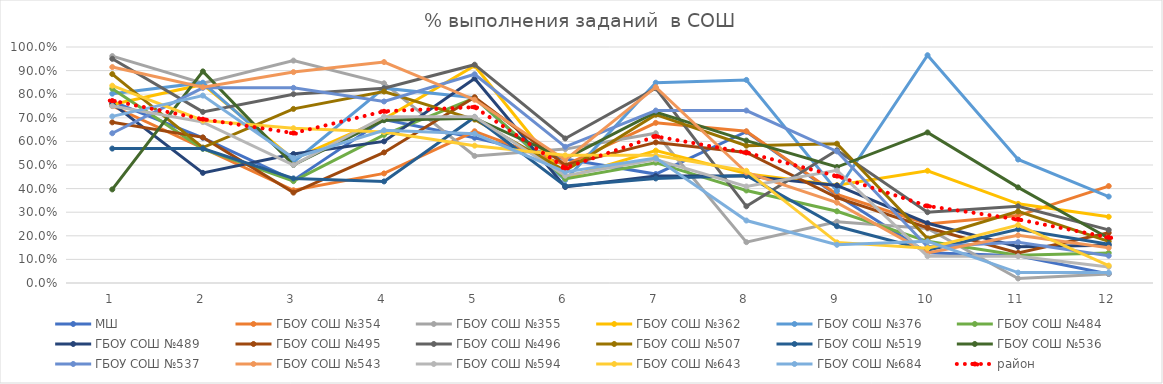
| Category | МШ | ГБОУ СОШ №354 | ГБОУ СОШ №355 | ГБОУ СОШ №362 | ГБОУ СОШ №376 | ГБОУ СОШ №484 | ГБОУ СОШ №489 | ГБОУ СОШ №495 | ГБОУ СОШ №496 | ГБОУ СОШ №507 | ГБОУ СОШ №519 | ГБОУ СОШ №536 | ГБОУ СОШ №537 | ГБОУ СОШ №543 | ГБОУ СОШ №594 | ГБОУ СОШ №643 | ГБОУ СОШ №684 | район |
|---|---|---|---|---|---|---|---|---|---|---|---|---|---|---|---|---|---|---|
| 0 | 0.769 | 0.75 | 0.962 | 0.756 | 0.802 | 0.824 | 0.76 | 0.681 | 0.95 | 0.885 | 0.57 | 0.397 | 0.635 | 0.915 | 0.75 | 0.836 | 0.706 | 0.773 |
| 1 | 0.615 | 0.571 | 0.846 | 0.841 | 0.849 | 0.569 | 0.467 | 0.617 | 0.725 | 0.574 | 0.57 | 0.897 | 0.827 | 0.83 | 0.682 | 0.689 | 0.794 | 0.694 |
| 2 | 0.436 | 0.393 | 0.942 | 0.524 | 0.512 | 0.431 | 0.547 | 0.383 | 0.8 | 0.738 | 0.443 | 0.5 | 0.827 | 0.894 | 0.5 | 0.656 | 0.529 | 0.635 |
| 3 | 0.692 | 0.464 | 0.846 | 0.695 | 0.826 | 0.627 | 0.6 | 0.553 | 0.825 | 0.811 | 0.43 | 0.69 | 0.769 | 0.936 | 0.705 | 0.639 | 0.647 | 0.728 |
| 4 | 0.615 | 0.643 | 0.538 | 0.921 | 0.785 | 0.784 | 0.867 | 0.787 | 0.925 | 0.693 | 0.703 | 0.698 | 0.885 | 0.777 | 0.705 | 0.582 | 0.632 | 0.745 |
| 5 | 0.526 | 0.5 | 0.567 | 0.445 | 0.436 | 0.441 | 0.407 | 0.5 | 0.612 | 0.475 | 0.411 | 0.526 | 0.577 | 0.521 | 0.455 | 0.541 | 0.471 | 0.488 |
| 6 | 0.462 | 0.679 | 0.635 | 0.561 | 0.849 | 0.51 | 0.453 | 0.596 | 0.825 | 0.713 | 0.443 | 0.724 | 0.731 | 0.83 | 0.523 | 0.541 | 0.529 | 0.622 |
| 7 | 0.641 | 0.643 | 0.173 | 0.463 | 0.86 | 0.392 | 0.453 | 0.553 | 0.325 | 0.582 | 0.456 | 0.603 | 0.731 | 0.468 | 0.409 | 0.475 | 0.265 | 0.552 |
| 8 | 0.372 | 0.375 | 0.26 | 0.415 | 0.39 | 0.304 | 0.413 | 0.362 | 0.562 | 0.59 | 0.241 | 0.491 | 0.558 | 0.34 | 0.477 | 0.172 | 0.162 | 0.453 |
| 9 | 0.128 | 0.25 | 0.231 | 0.476 | 0.965 | 0.176 | 0.253 | 0.234 | 0.3 | 0.189 | 0.139 | 0.638 | 0.154 | 0.128 | 0.114 | 0.148 | 0.176 | 0.326 |
| 10 | 0.115 | 0.286 | 0.019 | 0.335 | 0.523 | 0.118 | 0.153 | 0.128 | 0.325 | 0.303 | 0.228 | 0.405 | 0.173 | 0.202 | 0.114 | 0.246 | 0.044 | 0.269 |
| 11 | 0.038 | 0.411 | 0.038 | 0.28 | 0.366 | 0.127 | 0.16 | 0.213 | 0.225 | 0.176 | 0.165 | 0.19 | 0.115 | 0.149 | 0.068 | 0.074 | 0.044 | 0.193 |